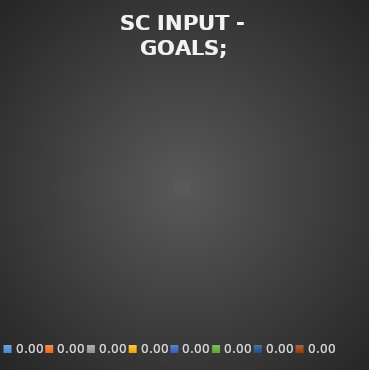
| Category | Input |
|---|---|
| 0.0 | 0 |
| 0.0 | 0 |
| 0.0 | 0 |
| 0.0 | 0 |
| 0.0 | 0 |
| 0.0 | 0 |
| 0.0 | 0 |
| 0.0 | 0 |